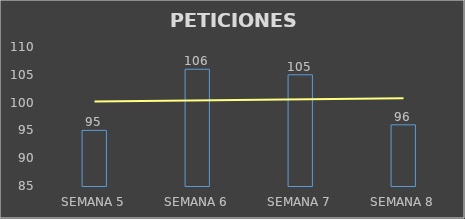
| Category | Series 0 |
|---|---|
| SEMANA 5 | 95 |
| SEMANA 6 | 106 |
| SEMANA 7 | 105 |
| SEMANA 8 | 96 |